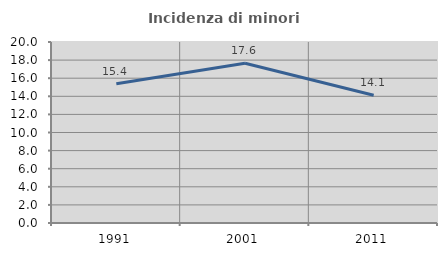
| Category | Incidenza di minori stranieri |
|---|---|
| 1991.0 | 15.385 |
| 2001.0 | 17.647 |
| 2011.0 | 14.118 |